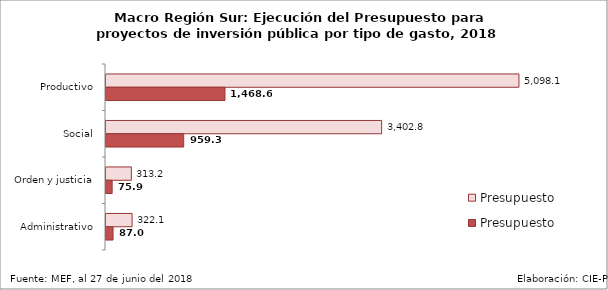
| Category | Presupuesto | Presupuesto Ejecutado |
|---|---|---|
| Productivo | 5098.124 | 1468.649 |
| Social | 3402.793 | 959.308 |
| Orden y justicia | 313.184 | 75.899 |
| Administrativo | 322.11 | 86.974 |